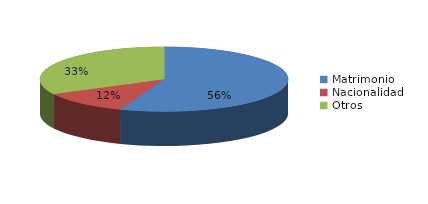
| Category | Series 0 |
|---|---|
| Matrimonio | 892 |
| Nacionalidad | 185 |
| Otros | 524 |